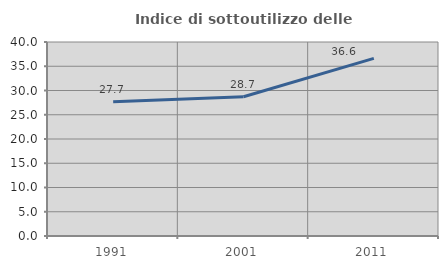
| Category | Indice di sottoutilizzo delle abitazioni  |
|---|---|
| 1991.0 | 27.69 |
| 2001.0 | 28.716 |
| 2011.0 | 36.627 |